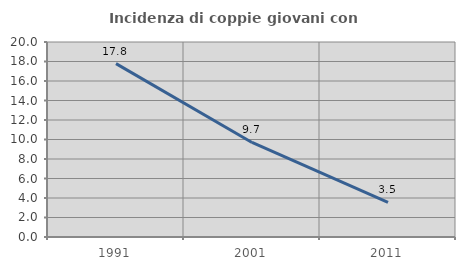
| Category | Incidenza di coppie giovani con figli |
|---|---|
| 1991.0 | 17.786 |
| 2001.0 | 9.696 |
| 2011.0 | 3.543 |